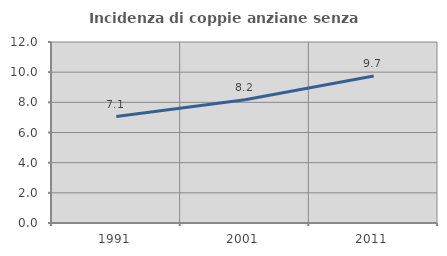
| Category | Incidenza di coppie anziane senza figli  |
|---|---|
| 1991.0 | 7.06 |
| 2001.0 | 8.168 |
| 2011.0 | 9.744 |